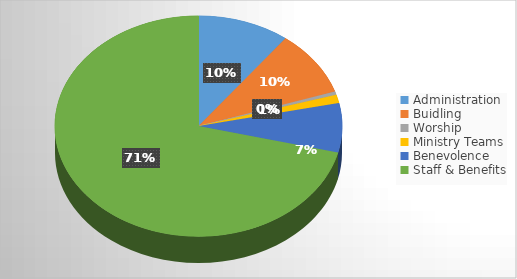
| Category | Series 0 |
|---|---|
| Administration | 8285.59 |
| Buidling  | 7687.74 |
| Worship | 378.44 |
| Ministry Teams | 992.85 |
| Benevolence | 5790.05 |
| Staff & Benefits | 57045.37 |